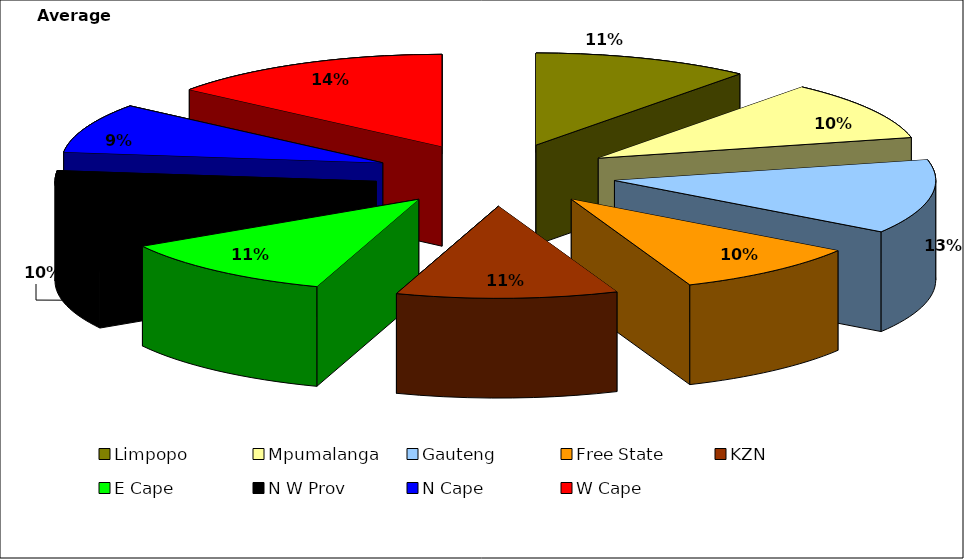
| Category | Average 2008 |
|---|---|
| Limpopo | 837259.75 |
| Mpumalanga | 799660.175 |
| Gauteng | 996286.675 |
| Free State | 732253.025 |
| KZN | 853513.75 |
| E Cape | 867662.7 |
| N W Prov | 793647.45 |
| N Cape | 669110.7 |
| W Cape | 1102056.65 |